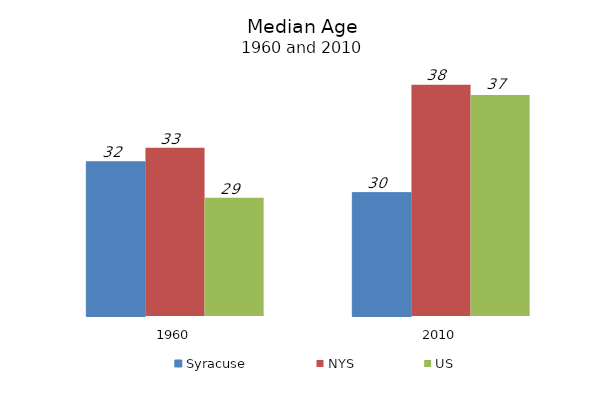
| Category | Syracuse | NYS | US |
|---|---|---|---|
| 1960.0 | 32 | 33.1 | 29.2 |
| 2010.0 | 29.6 | 38 | 37.2 |